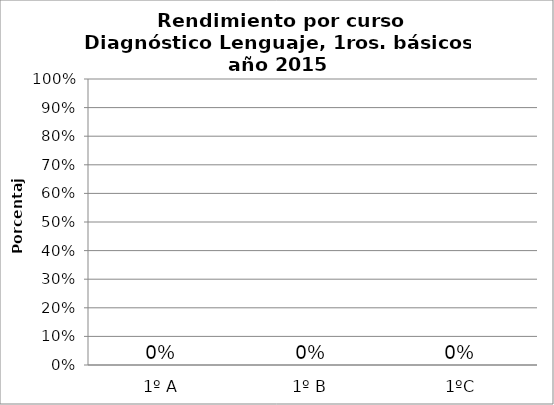
| Category | Series 0 |
|---|---|
| 1º A | 0 |
| 1º B | 0 |
| 1ºC | 0 |